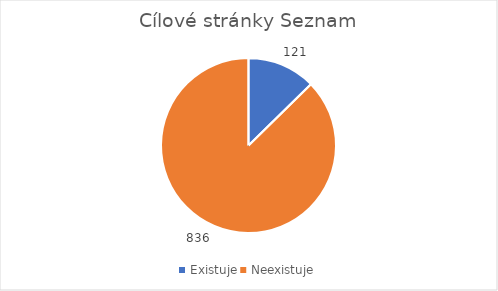
| Category | Series 0 |
|---|---|
| Existuje | 121 |
| Neexistuje | 836 |